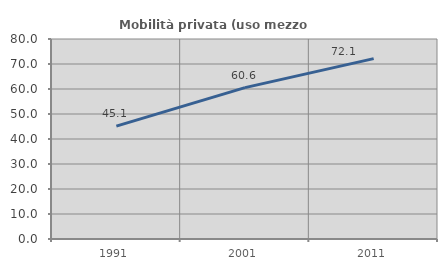
| Category | Mobilità privata (uso mezzo privato) |
|---|---|
| 1991.0 | 45.146 |
| 2001.0 | 60.554 |
| 2011.0 | 72.145 |